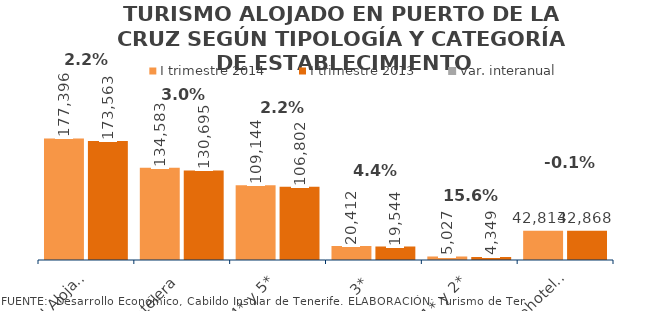
| Category | I trimestre 2014 | I trimestre 2013 |
|---|---|---|
| Total Alojados | 177396 | 173563 |
| Hotelera | 134583 | 130695 |
| 4* y 5* | 109144 | 106802 |
| 3* | 20412 | 19544 |
| 1* y 2* | 5027 | 4349 |
| Extrahotelera | 42813 | 42868 |